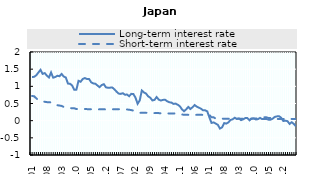
| Category | Long-term interest rate | Short-term interest rate |
|---|---|---|
| 2009-01 | 1.272 | 0.72 |
| 2009-02 | 1.277 | 0.71 |
| 2009-03 | 1.323 | 0.65 |
| 2009-04 | 1.402 | 0.6 |
| 2009-05 | 1.481 | 0.57 |
| 2009-06 | 1.363 | 0.56 |
| 2009-07 | 1.386 | 0.55 |
| 2009-08 | 1.314 | 0.54 |
| 2009-09 | 1.258 | 0.54 |
| 2009-10 | 1.404 | 0.53 |
| 2009-11 | 1.253 | 0.51 |
| 2009-12 | 1.272 | 0.46 |
| 2010-01 | 1.308 | 0.45 |
| 2010-02 | 1.295 | 0.44 |
| 2010-03 | 1.361 | 0.43 |
| 2010-04 | 1.286 | 0.4 |
| 2010-05 | 1.257 | 0.39 |
| 2010-06 | 1.08 | 0.38 |
| 2010-07 | 1.075 | 0.37 |
| 2010-08 | 1.023 | 0.36 |
| 2010-09 | 0.898 | 0.36 |
| 2010-10 | 0.903 | 0.34 |
| 2010-11 | 1.161 | 0.34 |
| 2010-12 | 1.133 | 0.34 |
| 2011-01 | 1.213 | 0.34 |
| 2011-02 | 1.241 | 0.34 |
| 2011-03 | 1.214 | 0.336 |
| 2011-04 | 1.215 | 0.333 |
| 2011-05 | 1.118 | 0.332 |
| 2011-06 | 1.084 | 0.332 |
| 2011-07 | 1.075 | 0.332 |
| 2011-08 | 1.023 | 0.329 |
| 2011-09 | 0.975 | 0.329 |
| 2011-10 | 1.038 | 0.329 |
| 2011-11 | 1.062 | 0.329 |
| 2011-12 | 0.971 | 0.329 |
| 2012-01 | 0.959 | 0.331 |
| 2012-02 | 0.962 | 0.332 |
| 2012-03 | 0.966 | 0.332 |
| 2012-04 | 0.914 | 0.332 |
| 2012-05 | 0.846 | 0.332 |
| 2012-06 | 0.789 | 0.335 |
| 2012-07 | 0.78 | 0.327 |
| 2012-08 | 0.8 | 0.327 |
| 2012-09 | 0.757 | 0.327 |
| 2012-10 | 0.76 | 0.326 |
| 2012-11 | 0.713 | 0.318 |
| 2012-12 | 0.781 | 0.308 |
| 2013-01 | 0.775 | 0.292 |
| 2013-02 | 0.669 | 0.269 |
| 2013-03 | 0.492 | 0.25 |
| 2013-04 | 0.589 | 0.228 |
| 2013-05 | 0.879 | 0.228 |
| 2013-06 | 0.822 | 0.228 |
| 2013-07 | 0.79 | 0.228 |
| 2013-08 | 0.708 | 0.228 |
| 2013-09 | 0.669 | 0.228 |
| 2013-10 | 0.59 | 0.221 |
| 2013-11 | 0.605 | 0.22 |
| 2013-12 | 0.688 | 0.22 |
| 2014-01 | 0.614 | 0.22 |
| 2014-02 | 0.586 | 0.212 |
| 2014-03 | 0.605 | 0.212 |
| 2014-04 | 0.61 | 0.212 |
| 2014-05 | 0.566 | 0.21 |
| 2014-06 | 0.536 | 0.21 |
| 2014-07 | 0.527 | 0.21 |
| 2014-08 | 0.488 | 0.21 |
| 2014-09 | 0.497 | 0.21 |
| 2014-10 | 0.465 | 0.192 |
| 2014-11 | 0.42 | 0.182 |
| 2014-12 | 0.33 | 0.179 |
| 2015-01 | 0.275 | 0.173 |
| 2015-02 | 0.33 | 0.171 |
| 2015-03 | 0.4 | 0.17 |
| 2015-04 | 0.34 | 0.17 |
| 2015-05 | 0.39 | 0.169 |
| 2015-06 | 0.455 | 0.169 |
| 2015-07 | 0.41 | 0.169 |
| 2015-08 | 0.38 | 0.169 |
| 2015-09 | 0.35 | 0.169 |
| 2015-10 | 0.3 | 0.169 |
| 2015-11 | 0.3 | 0.169 |
| 2015-12 | 0.27 | 0.169 |
| 2016-01 | 0.095 | 0.169 |
| 2016-02 | -0.065 | 0.098 |
| 2016-03 | -0.05 | 0.098 |
| 2016-04 | -0.085 | 0.06 |
| 2016-05 | -0.12 | 0.06 |
| 2016-06 | -0.23 | 0.059 |
| 2016-07 | -0.195 | 0.058 |
| 2016-08 | -0.07 | 0.058 |
| 2016-09 | -0.085 | 0.056 |
| 2016-10 | -0.05 | 0.056 |
| 2016-11 | 0.02 | 0.056 |
| 2016-12 | 0.04 | 0.056 |
| 2017-01 | 0.085 | 0.056 |
| 2017-02 | 0.05 | 0.056 |
| 2017-03 | 0.065 | 0.056 |
| 2017-04 | 0.015 | 0.056 |
| 2017-05 | 0.04 | 0.056 |
| 2017-06 | 0.075 | 0.056 |
| 2017-07 | 0.075 | 0.075 |
| 2017-08 | 0.01 | 0.056 |
| 2017-09 | 0.06 | 0.056 |
| 2017-10 | 0.065 | 0.063 |
| 2017-11 | 0.035 | 0.063 |
| 2017-12 | 0.045 | 0.063 |
| 2018-01 | 0.08 | 0.068 |
| 2018-02 | 0.045 | 0.068 |
| 2018-03 | 0.045 | 0.097 |
| 2018-04 | 0.05 | 0.097 |
| 2018-05 | 0.03 | 0.078 |
| 2018-06 | 0.03 | 0.078 |
| 2018-07 | 0.06 | 0.091 |
| 2018-08 | 0.11 | 0.091 |
| 2018-09 | 0.125 | 0.05 |
| 2018-10 | 0.13 | 0.05 |
| 2018-11 | 0.085 | 0.05 |
| 2018-12 | -0.01 | 0.05 |
| 2019-01 | 0 | 0.03 |
| 2019-02 | -0.015 | 0.03 |
| 2019-03 | -0.095 | 0.05 |
| 2019-04 | -0.045 | 0.05 |
| 2019-05 | -0.095 | 0.049 |
| 2019-06 | -0.165 | 0.049 |